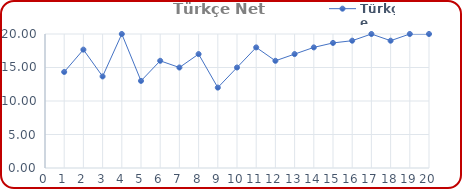
| Category | Türkçe |
|---|---|
| 0 | 14.333 |
| 1 | 17.667 |
| 2 | 13.667 |
| 3 | 20 |
| 4 | 13 |
| 5 | 16 |
| 6 | 15 |
| 7 | 17 |
| 8 | 12 |
| 9 | 15 |
| 10 | 18 |
| 11 | 16 |
| 12 | 17 |
| 13 | 18 |
| 14 | 18.667 |
| 15 | 19 |
| 16 | 20 |
| 17 | 19 |
| 18 | 20 |
| 19 | 20 |